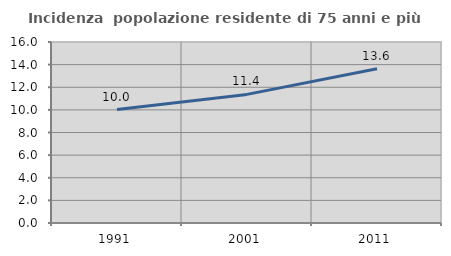
| Category | Incidenza  popolazione residente di 75 anni e più |
|---|---|
| 1991.0 | 10.031 |
| 2001.0 | 11.368 |
| 2011.0 | 13.628 |